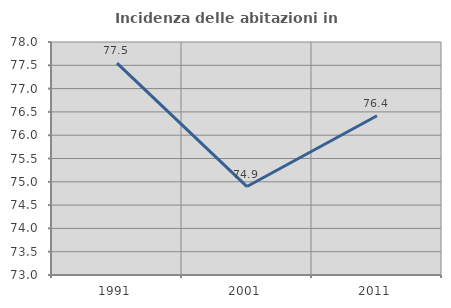
| Category | Incidenza delle abitazioni in proprietà  |
|---|---|
| 1991.0 | 77.548 |
| 2001.0 | 74.898 |
| 2011.0 | 76.417 |